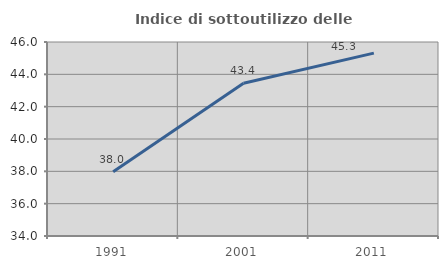
| Category | Indice di sottoutilizzo delle abitazioni  |
|---|---|
| 1991.0 | 37.976 |
| 2001.0 | 43.444 |
| 2011.0 | 45.31 |